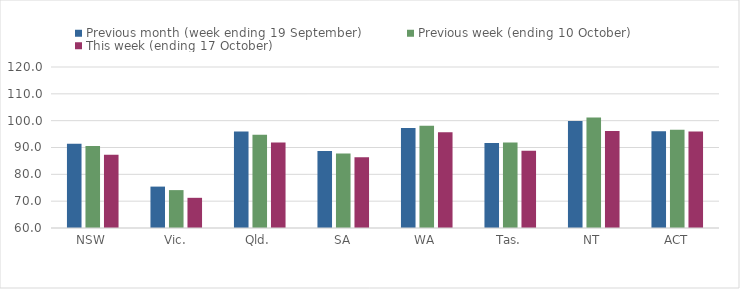
| Category | Previous month (week ending 19 September) | Previous week (ending 10 October) | This week (ending 17 October) |
|---|---|---|---|
| NSW | 91.36 | 90.57 | 87.28 |
| Vic. | 75.43 | 74.12 | 71.25 |
| Qld. | 95.98 | 94.75 | 91.88 |
| SA | 88.65 | 87.76 | 86.35 |
| WA | 97.25 | 98.06 | 95.72 |
| Tas. | 91.72 | 91.89 | 88.82 |
| NT | 99.91 | 101.14 | 96.11 |
| ACT | 96.08 | 96.6 | 95.92 |